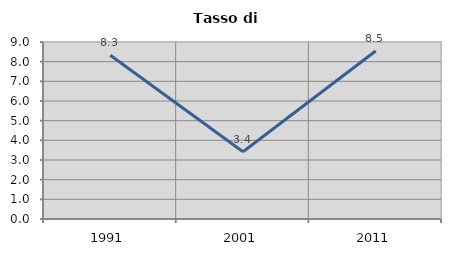
| Category | Tasso di disoccupazione   |
|---|---|
| 1991.0 | 8.324 |
| 2001.0 | 3.423 |
| 2011.0 | 8.539 |